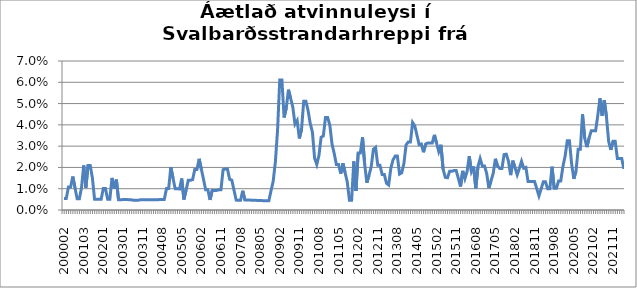
| Category | Series 0 |
|---|---|
| 200002 | 0.005 |
| 200003 | 0.005 |
| 200005 | 0.011 |
| 200006 | 0.011 |
| 200007 | 0.016 |
| 200008 | 0.01 |
| 200012 | 0.005 |
| 200101 | 0.005 |
| 200102 | 0.01 |
| 200103 | 0.021 |
| 200104 | 0.01 |
| 200105 | 0.021 |
| 200106 | 0.021 |
| 200107 | 0.015 |
| 200108 | 0.005 |
| 200109 | 0.005 |
| 200111 | 0.005 |
| 200112 | 0.005 |
| 200201 | 0.01 |
| 200202 | 0.01 |
| 200203 | 0.005 |
| 200204 | 0.005 |
| 200205 | 0.015 |
| 200206 | 0.01 |
| 200207 | 0.014 |
| 200209 | 0.005 |
| 200210 | 0.005 |
| 200301 | 0.005 |
| 200302 | 0.005 |
| 200303 | 0.005 |
| 200304 | 0.005 |
| 200305 | 0.005 |
| 200307 | 0.005 |
| 200308 | 0.005 |
| 200309 | 0.005 |
| 200310 | 0.005 |
| 200311 | 0.005 |
| 200312 | 0.005 |
| 200401 | 0.005 |
| 200402 | 0.005 |
| 200403 | 0.005 |
| 200404 | 0.005 |
| 200405 | 0.005 |
| 200406 | 0.005 |
| 200407 | 0.005 |
| 200408 | 0.005 |
| 200409 | 0.005 |
| 200410 | 0.01 |
| 200411 | 0.01 |
| 200412 | 0.02 |
| 200501 | 0.015 |
| 200502 | 0.01 |
| 200503 | 0.01 |
| 200504 | 0.01 |
| 200505 | 0.015 |
| 200506 | 0.005 |
| 200507 | 0.009 |
| 200508 | 0.014 |
| 200509 | 0.014 |
| 200510 | 0.014 |
| 200511 | 0.019 |
| 200512 | 0.019 |
| 200601 | 0.024 |
| 200602 | 0.019 |
| 200603 | 0.014 |
| 200604 | 0.009 |
| 200605 | 0.009 |
| 200606 | 0.005 |
| 200607 | 0.009 |
| 200608 | 0.009 |
| 200609 | 0.009 |
| 200610 | 0.009 |
| 200611 | 0.009 |
| 200612 | 0.019 |
| 200701 | 0.019 |
| 200702 | 0.019 |
| 200703 | 0.014 |
| 200704 | 0.014 |
| 200705 | 0.009 |
| 200706 | 0.005 |
| 200707 | 0.005 |
| 200708 | 0.005 |
| 200709 | 0.009 |
| 200710 | 0.005 |
| 200711 | 0.005 |
| 200712 | 0.005 |
| 200801 | 0.005 |
| 200802 | 0.005 |
| 200803 | 0.005 |
| 200804 | 0.004 |
| 200805 | 0.004 |
| 200806 | 0.004 |
| 200807 | 0.004 |
| 200808 | 0.004 |
| 200809 | 0.004 |
| 200810 | 0.009 |
| 200811 | 0.014 |
| 200812 | 0.023 |
| 200901 | 0.038 |
| 200902 | 0.061 |
| 200903 | 0.061 |
| 200904 | 0.043 |
| 200905 | 0.048 |
| 200906 | 0.057 |
| 200907 | 0.052 |
| 200908 | 0.048 |
| 200909 | 0.04 |
| 200910 | 0.042 |
| 200911 | 0.034 |
| 200912 | 0.038 |
| 201001 | 0.051 |
| 201002 | 0.051 |
| 201003 | 0.047 |
| 201004 | 0.041 |
| 201005 | 0.037 |
| 201006 | 0.024 |
| 201007 | 0.021 |
| 201008 | 0.026 |
| 201009 | 0.034 |
| 201010 | 0.035 |
| 201011 | 0.043 |
| 201012 | 0.043 |
| 201101 | 0.04 |
| 201102 | 0.031 |
| 201103 | 0.027 |
| 201104 | 0.021 |
| 201105 | 0.021 |
| 201106 | 0.017 |
| 201107 | 0.022 |
| 201108 | 0.018 |
| 201109 | 0.013 |
| 201110 | 0.005 |
| 201111 | 0.005 |
| 201112 | 0.023 |
| 201201 | 0.009 |
| 201202 | 0.027 |
| 201203 | 0.027 |
| 201204 | 0.034 |
| 201205 | 0.021 |
| 201206 | 0.013 |
| 201207 | 0.016 |
| 201208 | 0.02 |
| 201209 | 0.029 |
| 201210 | 0.029 |
| 201211 | 0.021 |
| 201212 | 0.021 |
| 201301 | 0.017 |
| 201302 | 0.017 |
| 201303 | 0.013 |
| 201304 | 0.012 |
| 201305 | 0.02 |
| 201306 | 0.024 |
| 201307 | 0.025 |
| 201308 | 0.025 |
| 201309 | 0.017 |
| 201310 | 0.017 |
| 201311 | 0.022 |
| 201312 | 0.031 |
| 201401 | 0.032 |
| 201402 | 0.032 |
| 201403 | 0.041 |
| 201404 | 0.039 |
| 201405 | 0.035 |
| 201406 | 0.031 |
| 201407 | 0.031 |
| 201408 | 0.027 |
| 201409 | 0.031 |
| 201410 | 0.031 |
| 201411 | 0.031 |
| 201412 | 0.031 |
| 201501 | 0.035 |
| 201502 | 0.031 |
| 201503 | 0.027 |
| 201504 | 0.031 |
| 201505 | 0.019 |
| 201506 | 0.015 |
| 201507 | 0.015 |
| 201508 | 0.018 |
| 201509 | 0.018 |
| 201510 | 0.019 |
| 201511 | 0.019 |
| 201512 | 0.015 |
| 201601 | 0.011 |
| 201602 | 0.018 |
| 201603 | 0.015 |
| 201604 | 0.018 |
| 201605 | 0.025 |
| 201606 | 0.018 |
| 201607 | 0.02 |
| 201608 | 0.01 |
| 201609 | 0.02 |
| 201610 | 0.024 |
| 201611 | 0.021 |
| 201612 | 0.021 |
| 201701 | 0.017 |
| 201702 | 0.01 |
| 201703 | 0.014 |
| 201704 | 0.017 |
| 201705 | 0.024 |
| 201706 | 0.021 |
| 201707 | 0.02 |
| 201708 | 0.02 |
| 201709 | 0.026 |
| 201710 | 0.026 |
| 201711 | 0.023 |
| 201712 | 0.016 |
| 201801 | 0.023 |
| 201802 | 0.02 |
| 201803 | 0.017 |
| 201804 | 0.02 |
| 201805 | 0.023 |
| 201806 | 0.02 |
| 201807 | 0.02 |
| 201808 | 0.013 |
| 201809 | 0.013 |
| 201810 | 0.013 |
| 201811 | 0.013 |
| 201812 | 0.01 |
| 201901 | 0.007 |
| 201902 | 0.01 |
| 201903 | 0.013 |
| 201904 | 0.013 |
| 201905 | 0.01 |
| 201906 | 0.01 |
| 201907 | 0.02 |
| 201908 | 0.01 |
| 201909 | 0.01 |
| 201910 | 0.014 |
| 201911 | 0.014 |
| 201912 | 0.02 |
| 202001 | 0.025 |
| 202002 | 0.032 |
| 202003 | 0.032 |
| 202004 | 0.022 |
| 202005 | 0.015 |
| 202006 | 0.018 |
| 202007 | 0.029 |
| 202008 | 0.029 |
| 202009 | 0.045 |
| 202010 | 0.034 |
| 202011 | 0.03 |
| 202012 | 0.034 |
| 202101 | 0.037 |
| 202102 | 0.037 |
| 202103 | 0.037 |
| 202104 | 0.044 |
| 202105 | 0.052 |
| 202106 | 0.044 |
| 202107 | 0.052 |
| 202108 | 0.044 |
| 202109 | 0.032 |
| 202110 | 0.028 |
| 202111 | 0.032 |
| 202112 | 0.032 |
| 202201 | 0.024 |
| 202202 | 0.024 |
| 202203 | 0.024 |
| 202204 | 0.019 |